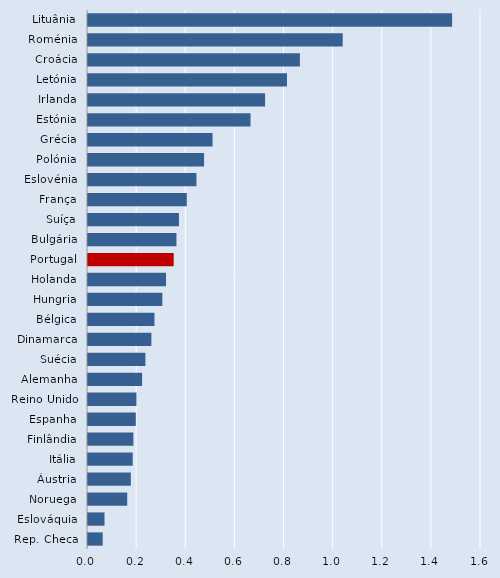
| Category | Series 0 |
|---|---|
| Lituânia | 1.482 |
| Roménia | 1.037 |
| Croácia | 0.863 |
| Letónia | 0.81 |
| Irlanda | 0.721 |
| Estónia | 0.662 |
| Grécia | 0.507 |
| Polónia | 0.473 |
| Eslovénia | 0.442 |
| França | 0.402 |
| Suíça | 0.37 |
| Bulgária | 0.36 |
| Portugal | 0.349 |
| Holanda | 0.318 |
| Hungria | 0.303 |
| Bélgica | 0.271 |
| Dinamarca | 0.258 |
| Suécia | 0.234 |
| Alemanha | 0.22 |
| Reino Unido | 0.197 |
| Espanha | 0.195 |
| Finlândia | 0.185 |
| Itália | 0.182 |
| Áustria | 0.174 |
| Noruega | 0.16 |
| Eslováquia | 0.067 |
| Rep. Checa | 0.06 |